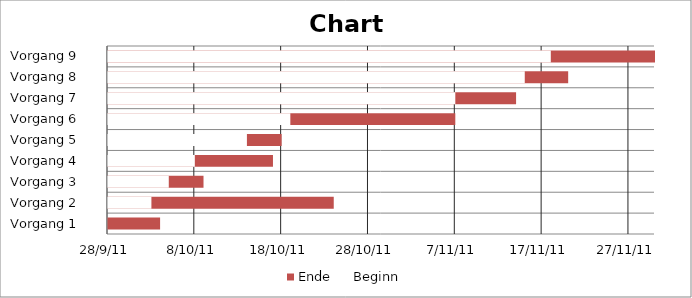
| Category | Ende | Beginn |
|---|---|---|
| Vorgang 1    | 04/10/2011 | 28/09/2011 |
| Vorgang 2    | 24/10/2011 | 03/10/2011 |
| Vorgang 3    | 09/10/2011 | 05/10/2011 |
| Vorgang 4    | 17/10/2011 | 08/10/2011 |
| Vorgang 5    | 18/10/2011 | 14/10/2011 |
| Vorgang 6    | 07/11/2011 | 19/10/2011 |
| Vorgang 7    | 14/11/2011 | 07/11/2011 |
| Vorgang 8    | 20/11/2011 | 15/11/2011 |
| Vorgang 9    | 30/11/2011 | 18/11/2011 |